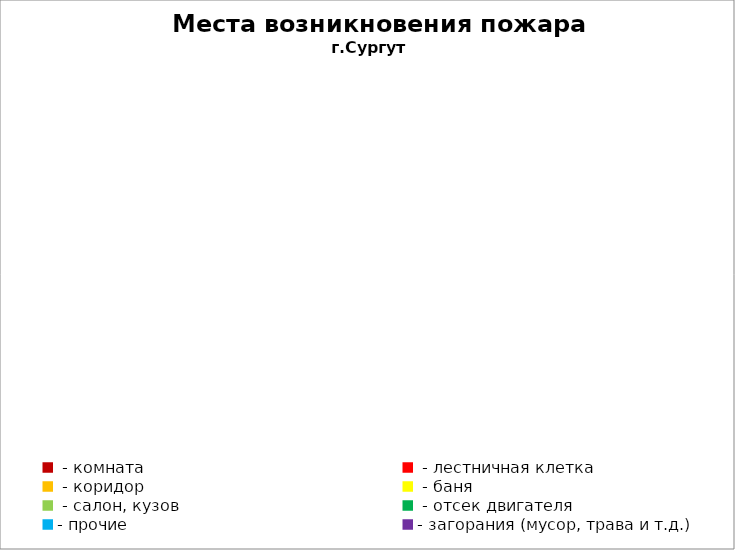
| Category | Места возникновения пожара |
|---|---|
|  - комната | 46 |
|  - лестничная клетка | 4 |
|  - коридор | 3 |
|  - баня | 22 |
|  - салон, кузов | 10 |
|  - отсек двигателя | 24 |
| - прочие | 66 |
| - загорания (мусор, трава и т.д.)  | 88 |